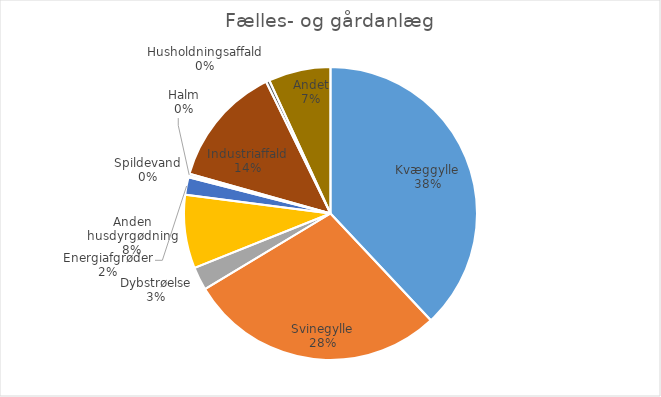
| Category | Series 0 |
|---|---|
| Kvæggylle | 2125647.02 |
| Svinegylle | 1587739.232 |
| Dybstrøelse | 143481.39 |
| Anden husdyrgødning | 453269.68 |
| Energiafgrøder | 107538.74 |
| Spildevand | 8901.08 |
| Halm | 13583.47 |
| Industriaffald | 749190.875 |
| Husholdningsaffald | 21703.01 |
| Andet | 383381.44 |